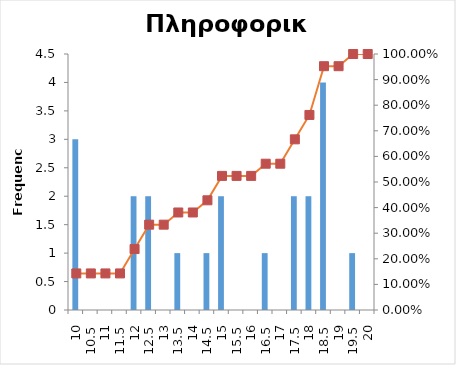
| Category | Series 0 |
|---|---|
| 10 | 3 |
| 10,5 | 0 |
| 11 | 0 |
| 11,5 | 0 |
| 12 | 2 |
| 12,5 | 2 |
| 13 | 0 |
| 13,5 | 1 |
| 14 | 0 |
| 14,5 | 1 |
| 15 | 2 |
| 15,5 | 0 |
| 16 | 0 |
| 16,5 | 1 |
| 17 | 0 |
| 17,5 | 2 |
| 18 | 2 |
| 18,5 | 4 |
| 19 | 0 |
| 19,5 | 1 |
| 20 | 0 |